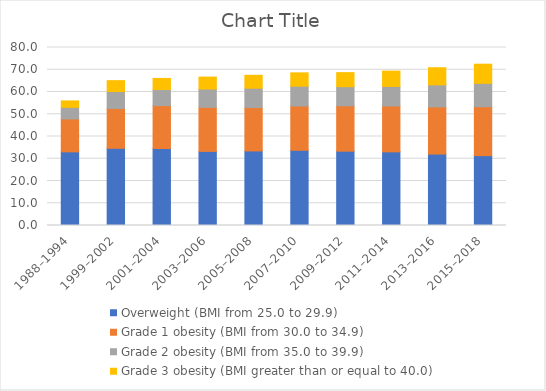
| Category | Overweight (BMI from 25.0 to 29.9) | Grade 1 obesity (BMI from 30.0 to 34.9) | Grade 2 obesity (BMI from 35.0 to 39.9) | Grade 3 obesity (BMI greater than or equal to 40.0) |
|---|---|---|---|---|
| 1988–1994 | 33.1 | 14.8 | 5.2 | 2.9 |
| 1999–2002 | 34.7 | 17.9 | 7.6 | 4.9 |
| 2001–2004 | 34.6 | 19.3 | 7.2 | 5 |
| 2003–2006 | 33.3 | 19.8 | 8.2 | 5.4 |
| 2005–2008 | 33.5 | 19.5 | 8.7 | 5.8 |
| 2007–2010 | 33.8 | 19.9 | 8.9 | 6 |
| 2009–2012 | 33.4 | 20.4 | 8.6 | 6.3 |
| 2011–2014 | 33.1 | 20.6 | 8.8 | 6.9 |
| 2013–2016 | 32.1 | 21.2 | 9.9 | 7.7 |
| 2015–2018 | 31.4 | 22 | 10.5 | 8.6 |